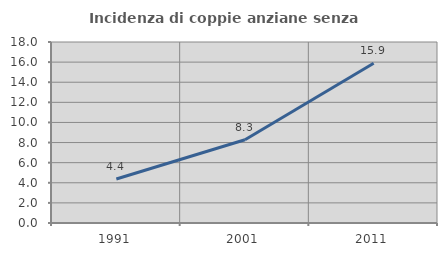
| Category | Incidenza di coppie anziane senza figli  |
|---|---|
| 1991.0 | 4.379 |
| 2001.0 | 8.283 |
| 2011.0 | 15.895 |